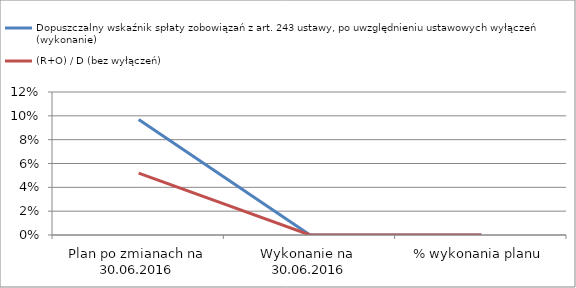
| Category | Dopuszczalny wskaźnik spłaty zobowiązań z art. 243 ustawy, po uwzględnieniu ustawowych wyłączeń (wykonanie)  | (R+O) / D (bez wyłączeń) |
|---|---|---|
| Plan po zmianach na 30.06.2016 | 0.097 | 0.052 |
| Wykonanie na  30.06.2016 | 0 | 0 |
| % wykonania planu | 0 | 0 |